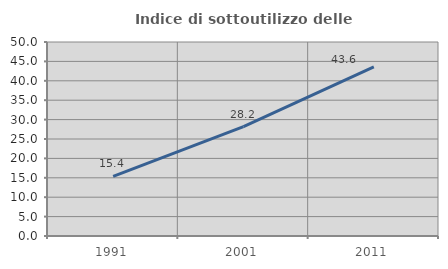
| Category | Indice di sottoutilizzo delle abitazioni  |
|---|---|
| 1991.0 | 15.385 |
| 2001.0 | 28.182 |
| 2011.0 | 43.564 |